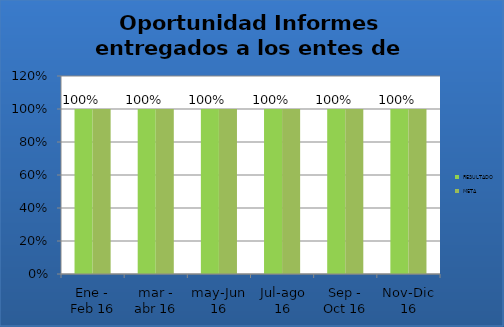
| Category | RESULTADO | META |
|---|---|---|
| Ene - Feb 16 | 1 | 1 |
| mar - abr 16 | 1 | 1 |
| may-Jun 16 | 1 | 1 |
| Jul-ago 16 | 1 | 1 |
| Sep - Oct 16 | 1 | 1 |
| Nov-Dic 16 | 1 | 1 |